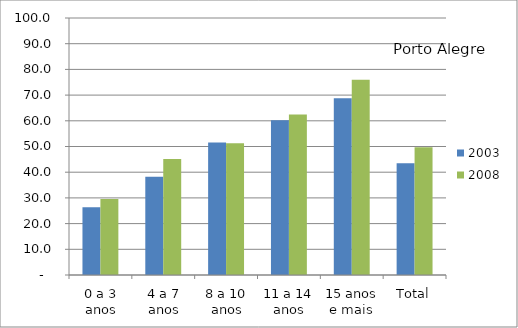
| Category | 2003 | 2008 |
|---|---|---|
| 0 a 3 anos | 26.35 | 29.54 |
| 4 a 7 anos | 38.21 | 45.18 |
| 8 a 10 anos | 51.56 | 51.3 |
| 11 a 14 anos | 60.23 | 62.46 |
| 15 anos e mais | 68.8 | 75.98 |
| Total | 43.51 | 49.75 |